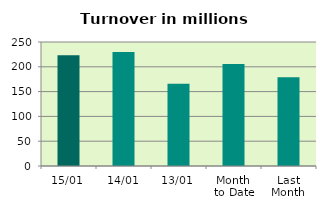
| Category | Series 0 |
|---|---|
| 15/01 | 223.231 |
| 14/01 | 230.036 |
| 13/01 | 165.929 |
| Month 
to Date | 205.868 |
| Last
Month | 179.047 |